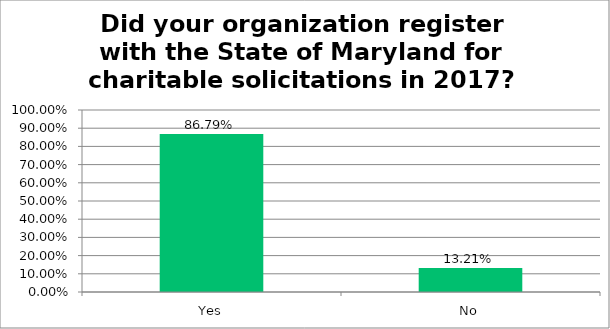
| Category | Responses |
|---|---|
| Yes | 0.868 |
| No | 0.132 |